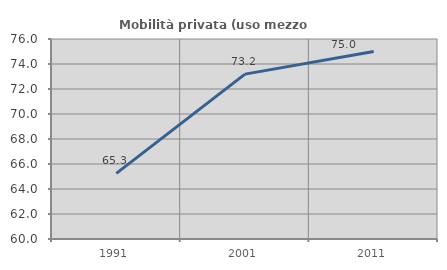
| Category | Mobilità privata (uso mezzo privato) |
|---|---|
| 1991.0 | 65.254 |
| 2001.0 | 73.191 |
| 2011.0 | 75.007 |